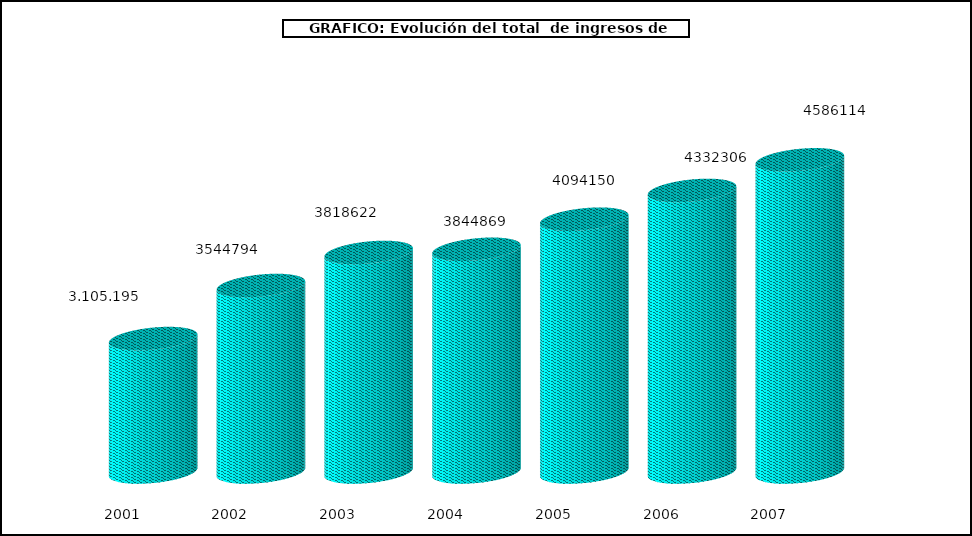
| Category | Series 0 |
|---|---|
| 2001.0 | 3105195 |
| 2002.0 | 3544794 |
| 2003.0 | 3818622 |
| 2004.0 | 3844869 |
| 2005.0 | 4094150 |
| 2006.0 | 4332306 |
| 2007.0 | 4586114 |